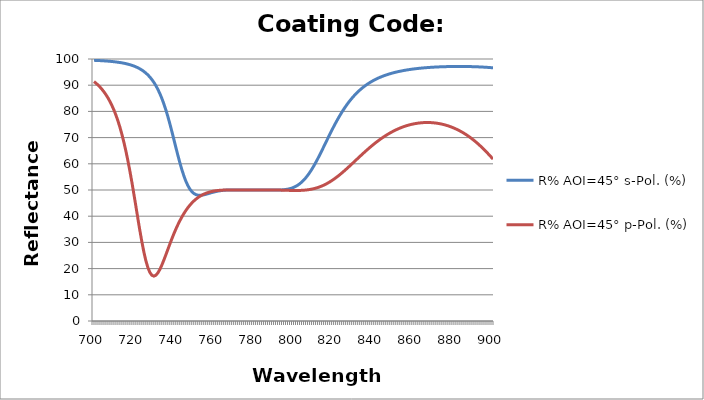
| Category | R% AOI=45° s-Pol. (%) | R% AOI=45° p-Pol. (%) |
|---|---|---|
| 700.0 | 99.491 | 91.382 |
| 701.0 | 99.459 | 90.76 |
| 702.0 | 99.424 | 90.066 |
| 703.0 | 99.384 | 89.291 |
| 704.0 | 99.341 | 88.425 |
| 705.0 | 99.293 | 87.454 |
| 706.0 | 99.24 | 86.367 |
| 707.0 | 99.182 | 85.146 |
| 708.0 | 99.116 | 83.776 |
| 709.0 | 99.043 | 82.236 |
| 710.0 | 98.962 | 80.505 |
| 711.0 | 98.871 | 78.561 |
| 712.0 | 98.769 | 76.38 |
| 713.0 | 98.655 | 73.938 |
| 714.0 | 98.527 | 71.212 |
| 715.0 | 98.382 | 68.182 |
| 716.0 | 98.218 | 64.832 |
| 717.0 | 98.033 | 61.161 |
| 718.0 | 97.824 | 57.176 |
| 719.0 | 97.585 | 52.908 |
| 720.0 | 97.314 | 48.411 |
| 721.0 | 97.004 | 43.767 |
| 722.0 | 96.651 | 39.09 |
| 723.0 | 96.245 | 34.519 |
| 724.0 | 95.78 | 30.211 |
| 725.0 | 95.246 | 26.33 |
| 726.0 | 94.632 | 23.024 |
| 727.0 | 93.925 | 20.407 |
| 728.0 | 93.11 | 18.551 |
| 729.0 | 92.172 | 17.47 |
| 730.0 | 91.093 | 17.131 |
| 731.0 | 89.854 | 17.458 |
| 732.0 | 88.435 | 18.345 |
| 733.0 | 86.817 | 19.677 |
| 734.0 | 84.982 | 21.336 |
| 735.0 | 82.917 | 23.215 |
| 736.0 | 80.616 | 25.221 |
| 737.0 | 78.084 | 27.278 |
| 738.0 | 75.34 | 29.326 |
| 739.0 | 72.419 | 31.321 |
| 740.0 | 69.378 | 33.231 |
| 741.0 | 66.36 | 35.01 |
| 742.0 | 63.379 | 36.674 |
| 743.0 | 60.522 | 38.218 |
| 744.0 | 57.871 | 39.64 |
| 745.0 | 55.497 | 40.94 |
| 746.0 | 53.45 | 42.121 |
| 747.0 | 51.756 | 43.19 |
| 748.0 | 50.418 | 44.15 |
| 749.0 | 49.416 | 45.009 |
| 750.0 | 48.715 | 45.773 |
| 751.0 | 48.272 | 46.449 |
| 752.0 | 48.039 | 47.043 |
| 753.0 | 47.969 | 47.562 |
| 754.0 | 48.02 | 48.012 |
| 755.0 | 48.154 | 48.399 |
| 756.0 | 48.342 | 48.729 |
| 757.0 | 48.558 | 49.007 |
| 758.0 | 48.783 | 49.24 |
| 759.0 | 49.004 | 49.431 |
| 760.0 | 49.21 | 49.586 |
| 761.0 | 49.396 | 49.709 |
| 762.0 | 49.557 | 49.805 |
| 763.0 | 49.693 | 49.878 |
| 764.0 | 49.802 | 49.93 |
| 765.0 | 49.886 | 49.966 |
| 766.0 | 49.949 | 49.989 |
| 767.0 | 49.993 | 50.001 |
| 768.0 | 50.021 | 50.006 |
| 769.0 | 50.035 | 50.006 |
| 770.0 | 50.04 | 50.002 |
| 771.0 | 50.037 | 49.996 |
| 772.0 | 50.03 | 49.99 |
| 773.0 | 50.02 | 49.985 |
| 774.0 | 50.01 | 49.981 |
| 775.0 | 50.001 | 49.978 |
| 776.0 | 49.994 | 49.978 |
| 777.0 | 49.99 | 49.98 |
| 778.0 | 49.988 | 49.984 |
| 779.0 | 49.988 | 49.99 |
| 780.0 | 49.99 | 49.997 |
| 781.0 | 49.993 | 50.005 |
| 782.0 | 49.997 | 50.013 |
| 783.0 | 50 | 50.02 |
| 784.0 | 50.002 | 50.027 |
| 785.0 | 50.002 | 50.032 |
| 786.0 | 50 | 50.035 |
| 787.0 | 49.996 | 50.035 |
| 788.0 | 49.991 | 50.032 |
| 789.0 | 49.985 | 50.026 |
| 790.0 | 49.98 | 50.016 |
| 791.0 | 49.98 | 50.003 |
| 792.0 | 49.986 | 49.986 |
| 793.0 | 50.004 | 49.967 |
| 794.0 | 50.038 | 49.945 |
| 795.0 | 50.094 | 49.921 |
| 796.0 | 50.179 | 49.897 |
| 797.0 | 50.302 | 49.873 |
| 798.0 | 50.469 | 49.851 |
| 799.0 | 50.691 | 49.833 |
| 800.0 | 50.977 | 49.82 |
| 801.0 | 51.336 | 49.815 |
| 802.0 | 51.777 | 49.818 |
| 803.0 | 52.309 | 49.834 |
| 804.0 | 52.94 | 49.863 |
| 805.0 | 53.674 | 49.909 |
| 806.0 | 54.516 | 49.974 |
| 807.0 | 55.466 | 50.061 |
| 808.0 | 56.524 | 50.171 |
| 809.0 | 57.685 | 50.308 |
| 810.0 | 58.942 | 50.473 |
| 811.0 | 60.285 | 50.669 |
| 812.0 | 61.702 | 50.897 |
| 813.0 | 63.18 | 51.159 |
| 814.0 | 64.704 | 51.457 |
| 815.0 | 66.258 | 51.79 |
| 816.0 | 67.826 | 52.16 |
| 817.0 | 69.394 | 52.566 |
| 818.0 | 70.948 | 53.008 |
| 819.0 | 72.475 | 53.486 |
| 820.0 | 73.966 | 53.997 |
| 821.0 | 75.41 | 54.541 |
| 822.0 | 76.8 | 55.115 |
| 823.0 | 78.132 | 55.717 |
| 824.0 | 79.402 | 56.344 |
| 825.0 | 80.607 | 56.993 |
| 826.0 | 81.746 | 57.662 |
| 827.0 | 82.819 | 58.347 |
| 828.0 | 83.828 | 59.045 |
| 829.0 | 84.773 | 59.753 |
| 830.0 | 85.658 | 60.467 |
| 831.0 | 86.484 | 61.184 |
| 832.0 | 87.255 | 61.901 |
| 833.0 | 87.972 | 62.616 |
| 834.0 | 88.641 | 63.324 |
| 835.0 | 89.262 | 64.025 |
| 836.0 | 89.84 | 64.715 |
| 837.0 | 90.377 | 65.393 |
| 838.0 | 90.876 | 66.056 |
| 839.0 | 91.339 | 66.702 |
| 840.0 | 91.77 | 67.331 |
| 841.0 | 92.17 | 67.941 |
| 842.0 | 92.542 | 68.53 |
| 843.0 | 92.888 | 69.099 |
| 844.0 | 93.21 | 69.645 |
| 845.0 | 93.509 | 70.169 |
| 846.0 | 93.787 | 70.67 |
| 847.0 | 94.046 | 71.148 |
| 848.0 | 94.288 | 71.601 |
| 849.0 | 94.512 | 72.031 |
| 850.0 | 94.721 | 72.438 |
| 851.0 | 94.916 | 72.82 |
| 852.0 | 95.098 | 73.178 |
| 853.0 | 95.268 | 73.512 |
| 854.0 | 95.426 | 73.823 |
| 855.0 | 95.573 | 74.11 |
| 856.0 | 95.71 | 74.374 |
| 857.0 | 95.838 | 74.614 |
| 858.0 | 95.958 | 74.832 |
| 859.0 | 96.069 | 75.026 |
| 860.0 | 96.172 | 75.197 |
| 861.0 | 96.269 | 75.346 |
| 862.0 | 96.358 | 75.471 |
| 863.0 | 96.442 | 75.574 |
| 864.0 | 96.519 | 75.655 |
| 865.0 | 96.591 | 75.713 |
| 866.0 | 96.657 | 75.748 |
| 867.0 | 96.719 | 75.761 |
| 868.0 | 96.775 | 75.751 |
| 869.0 | 96.827 | 75.718 |
| 870.0 | 96.874 | 75.662 |
| 871.0 | 96.918 | 75.583 |
| 872.0 | 96.957 | 75.48 |
| 873.0 | 96.992 | 75.354 |
| 874.0 | 97.024 | 75.203 |
| 875.0 | 97.052 | 75.028 |
| 876.0 | 97.076 | 74.828 |
| 877.0 | 97.097 | 74.603 |
| 878.0 | 97.114 | 74.352 |
| 879.0 | 97.128 | 74.075 |
| 880.0 | 97.139 | 73.772 |
| 881.0 | 97.146 | 73.441 |
| 882.0 | 97.151 | 73.088 |
| 883.0 | 97.153 | 72.707 |
| 884.0 | 97.152 | 72.297 |
| 885.0 | 97.147 | 71.859 |
| 886.0 | 97.139 | 71.391 |
| 887.0 | 97.128 | 70.894 |
| 888.0 | 97.113 | 70.366 |
| 889.0 | 97.095 | 69.809 |
| 890.0 | 97.074 | 69.22 |
| 891.0 | 97.049 | 68.602 |
| 892.0 | 97.02 | 67.953 |
| 893.0 | 96.987 | 67.275 |
| 894.0 | 96.951 | 66.567 |
| 895.0 | 96.91 | 65.832 |
| 896.0 | 96.865 | 65.07 |
| 897.0 | 96.815 | 64.284 |
| 898.0 | 96.761 | 63.475 |
| 899.0 | 96.701 | 62.646 |
| 900.0 | 96.636 | 61.801 |